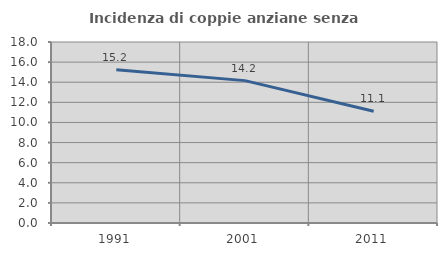
| Category | Incidenza di coppie anziane senza figli  |
|---|---|
| 1991.0 | 15.238 |
| 2001.0 | 14.159 |
| 2011.0 | 11.111 |